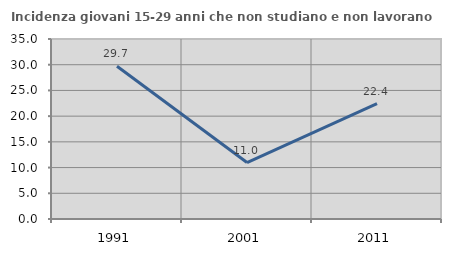
| Category | Incidenza giovani 15-29 anni che non studiano e non lavorano  |
|---|---|
| 1991.0 | 29.706 |
| 2001.0 | 10.98 |
| 2011.0 | 22.432 |